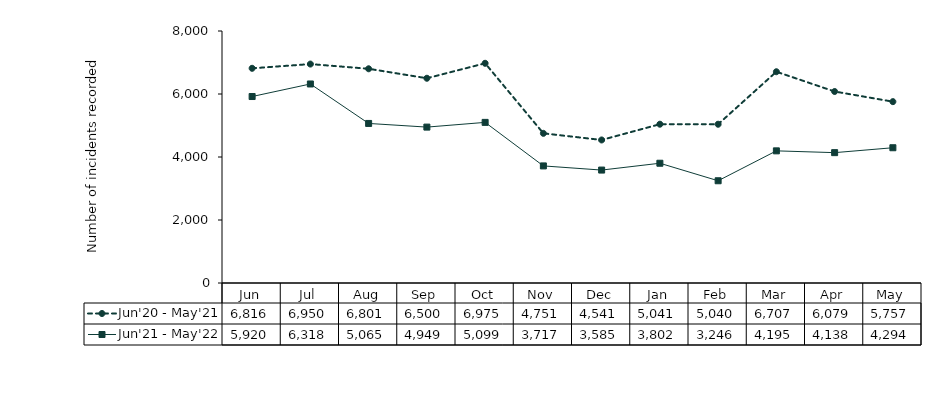
| Category | Jun'20 - May'21 | Jun'21 - May'22 |
|---|---|---|
| Jun | 6816 | 5920 |
| Jul | 6950 | 6318 |
| Aug | 6801 | 5065 |
| Sep | 6500 | 4949 |
| Oct | 6975 | 5099 |
| Nov | 4751 | 3717 |
| Dec | 4541 | 3585 |
| Jan | 5041 | 3802 |
| Feb | 5040 | 3246 |
| Mar | 6707 | 4195 |
| Apr | 6079 | 4138 |
| May | 5757 | 4294 |